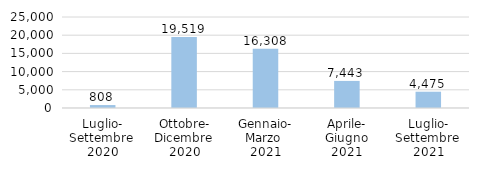
| Category | Italia |
|---|---|
| Luglio-
Settembre 
2020 | 807.62 |
| Ottobre-
Dicembre 
2020 | 19518.783 |
| Gennaio-
Marzo 
2021 | 16308.244 |
| Aprile-
Giugno
2021 | 7443.22 |
| Luglio-
Settembre 
2021 | 4474.609 |